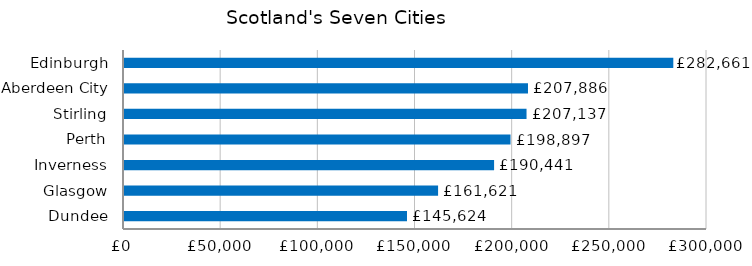
| Category | Series 0 |
|---|---|
| Dundee | 145624.457 |
| Glasgow | 161620.772 |
| Inverness | 190440.979 |
| Perth | 198896.533 |
| Stirling | 207137.35 |
| Aberdeen City | 207885.859 |
| Edinburgh | 282660.508 |